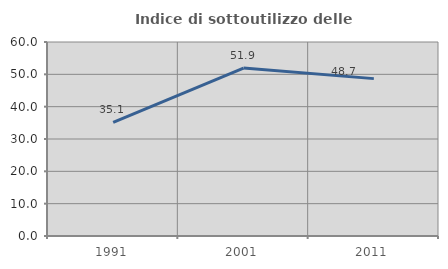
| Category | Indice di sottoutilizzo delle abitazioni  |
|---|---|
| 1991.0 | 35.135 |
| 2001.0 | 51.938 |
| 2011.0 | 48.673 |